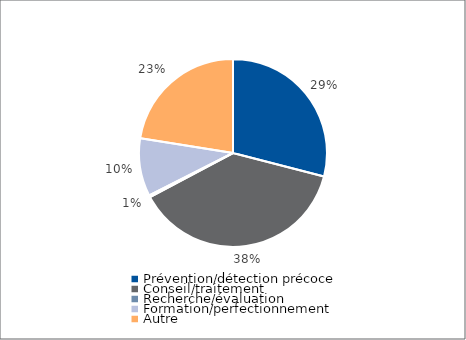
| Category | Series 0 |
|---|---|
| Prévention/détection précoce | 47167 |
| Conseil/traitement | 62100 |
| Recherche/évaluation | 532 |
| Formation/perfectionnement | 16250 |
| Autre | 36542 |